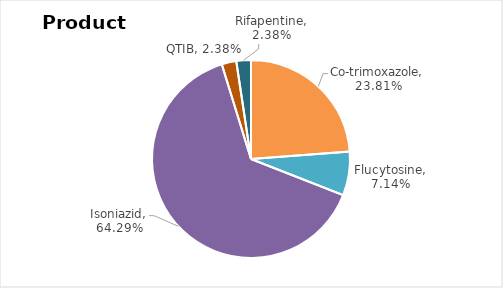
| Category | Total |
|---|---|
| Co-trimoxazole | 0.238 |
| Flucytosine | 0.071 |
| Isoniazid | 0.643 |
| QTIB | 0.024 |
| Rifapentine | 0.024 |